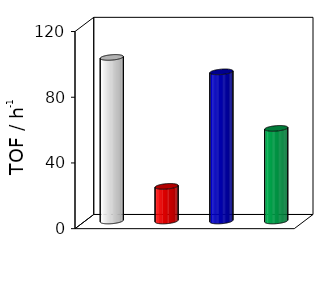
| Category | Series 0 |
|---|---|
| SBA-15 | 99.571 |
| Fe3O4@nSiO2(toluene) | 21.077 |
| Fe3O4@nSiO2@mSiO2(toluene) | 90.779 |
| Fe3O4@nSiO2@mSiO2(HSPG) | 56.376 |